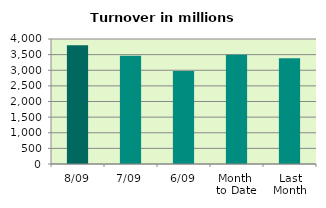
| Category | Series 0 |
|---|---|
| 8/09 | 3801.74 |
| 7/09 | 3465.195 |
| 6/09 | 2979.717 |
| Month 
to Date | 3496.148 |
| Last
Month | 3384.596 |